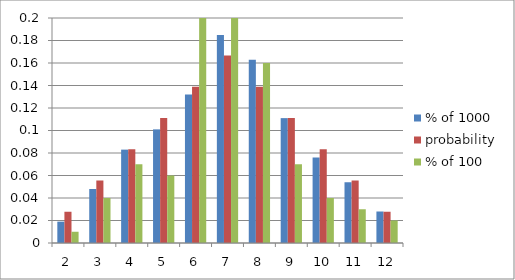
| Category | % of 1000 | probability | % of 100 |
|---|---|---|---|
| 2.0 | 0.019 | 0.028 | 0.01 |
| 3.0 | 0.048 | 0.056 | 0.04 |
| 4.0 | 0.083 | 0.083 | 0.07 |
| 5.0 | 0.101 | 0.111 | 0.06 |
| 6.0 | 0.132 | 0.139 | 0.21 |
| 7.0 | 0.185 | 0.167 | 0.29 |
| 8.0 | 0.163 | 0.139 | 0.16 |
| 9.0 | 0.111 | 0.111 | 0.07 |
| 10.0 | 0.076 | 0.083 | 0.04 |
| 11.0 | 0.054 | 0.056 | 0.03 |
| 12.0 | 0.028 | 0.028 | 0.02 |